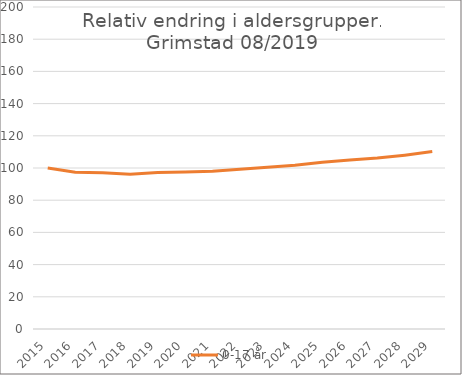
| Category | 0-17 år |
|---|---|
| 2015.0 | 100 |
| 2016.0 | 97.359 |
| 2017.0 | 97.108 |
| 2018.0 | 96.112 |
| 2019.0 | 97.138 |
| 2020.0 | 97.57 |
| 2021.0 | 97.937 |
| 2022.0 | 99.151 |
| 2023.0 | 100.515 |
| 2024.0 | 101.698 |
| 2025.0 | 103.604 |
| 2026.0 | 104.925 |
| 2027.0 | 106.148 |
| 2028.0 | 107.986 |
| 2029.0 | 110.192 |